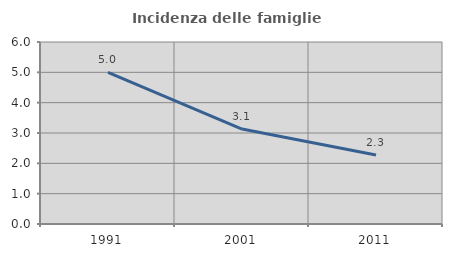
| Category | Incidenza delle famiglie numerose |
|---|---|
| 1991.0 | 5 |
| 2001.0 | 3.13 |
| 2011.0 | 2.273 |